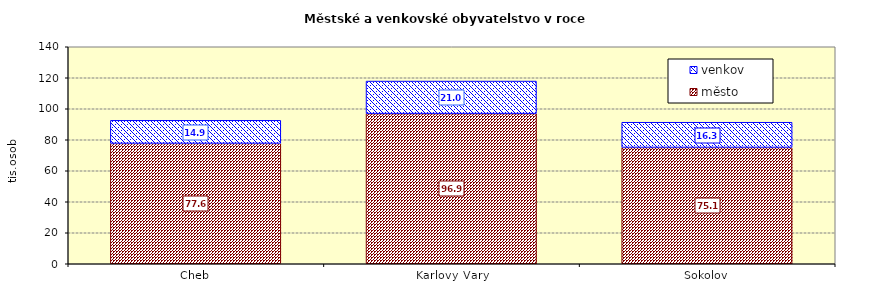
| Category | město | venkov |
|---|---|---|
| Cheb | 77627 | 14930 |
| Karlovy Vary | 96861 | 21007 |
| Sokolov | 75050 | 16251 |